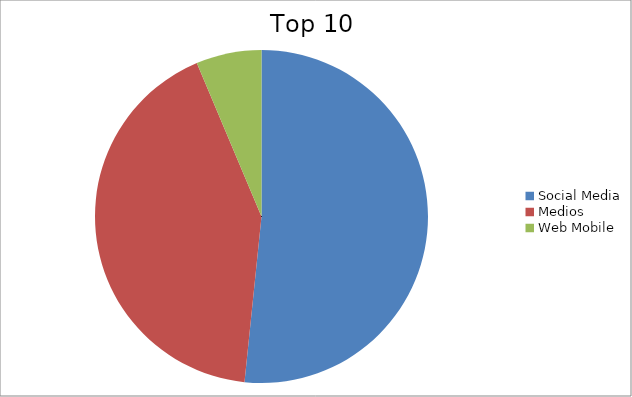
| Category | Series 0 |
|---|---|
| Social Media | 51.63 |
| Medios | 42.02 |
| Web Mobile | 6.35 |